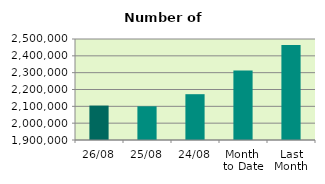
| Category | Series 0 |
|---|---|
| 26/08 | 2104442 |
| 25/08 | 2100186 |
| 24/08 | 2172118 |
| Month 
to Date | 2313014.105 |
| Last
Month | 2465054.636 |